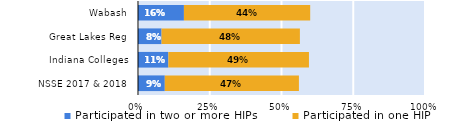
| Category | Participated in two or more HIPs | Participated in one HIP |
|---|---|---|
| NSSE 2017 & 2018 | 0.093 | 0.467 |
| Indiana Colleges | 0.106 | 0.49 |
| Great Lakes Reg | 0.082 | 0.482 |
| Wabash | 0.16 | 0.44 |